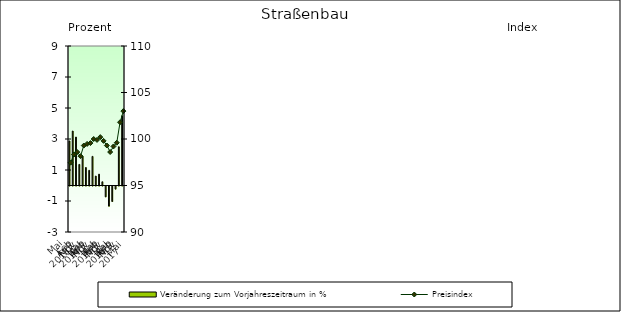
| Category | Veränderung zum Vorjahreszeitraum in % |
|---|---|
| 0 | 2.873 |
| 1 | 3.512 |
| 2 | 3.122 |
| 3 | 1.36 |
| 4 | 1.892 |
| 5 | 1.161 |
| 6 | 0.98 |
| 7 | 1.878 |
| 8 | 0.607 |
| 9 | 0.731 |
| 10 | 0.24 |
| 11 | -0.7 |
| 12 | -1.3 |
| 13 | -1 |
| 14 | -0.2 |
| 15 | 2.5 |
| 16 | 4.5 |